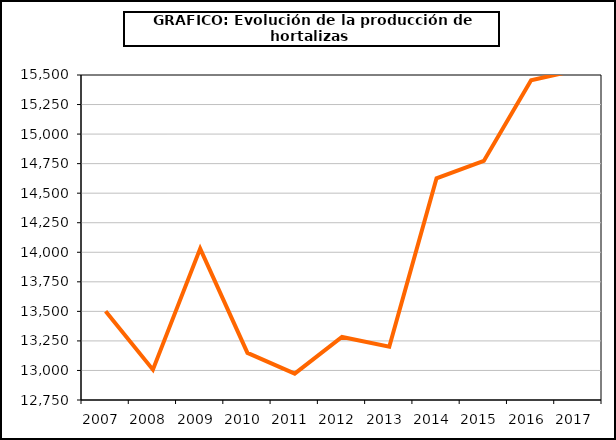
| Category | producción |
|---|---|
| 2007.0 | 13500.62 |
| 2008.0 | 13006.461 |
| 2009.0 | 14030.874 |
| 2010.0 | 13148.152 |
| 2011.0 | 12972.604 |
| 2012.0 | 13282.939 |
| 2013.0 | 13201.085 |
| 2014.0 | 14626.126 |
| 2015.0 | 14772.496 |
| 2016.0 | 15456.102 |
| 2017.0 | 15544.603 |